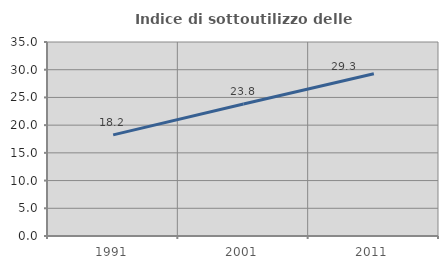
| Category | Indice di sottoutilizzo delle abitazioni  |
|---|---|
| 1991.0 | 18.239 |
| 2001.0 | 23.807 |
| 2011.0 | 29.257 |